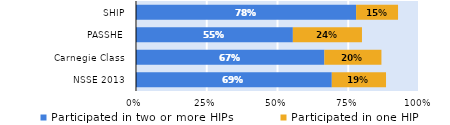
| Category | Participated in two or more HIPs | Participated in one HIP |
|---|---|---|
| NSSE 2013 | 0.692 | 0.192 |
| Carnegie Class | 0.666 | 0.202 |
| PASSHE | 0.554 | 0.244 |
| SHIP | 0.778 | 0.148 |